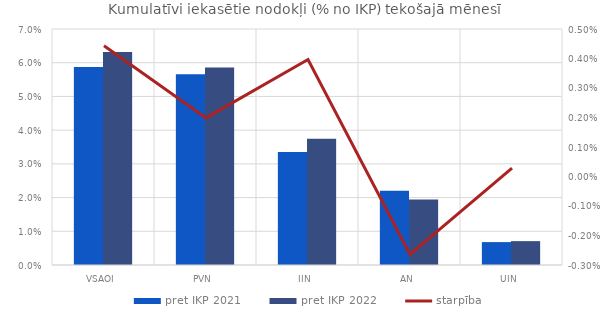
| Category | pret IKP 2021 | pret IKP 2022 |
|---|---|---|
| VSAOI | 0.059 | 0.063 |
| PVN | 0.057 | 0.059 |
| IIN | 0.033 | 0.037 |
| AN | 0.022 | 0.019 |
| UIN | 0.007 | 0.007 |